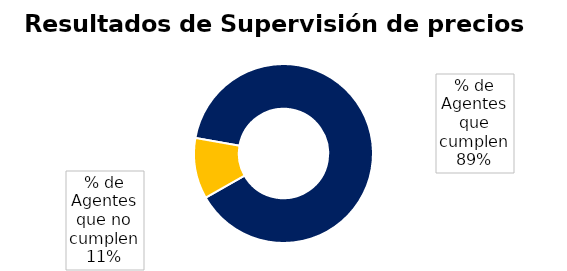
| Category | Cuenta de Departamento |
|---|---|
| % de Agentes que cumplen | 162 |
| % de Agentes que no cumplen | 20 |